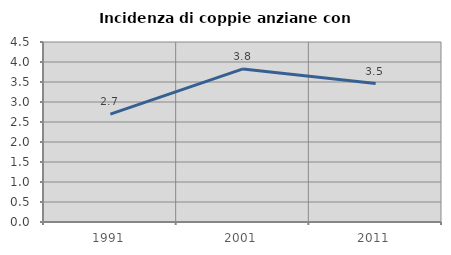
| Category | Incidenza di coppie anziane con figli |
|---|---|
| 1991.0 | 2.695 |
| 2001.0 | 3.827 |
| 2011.0 | 3.46 |